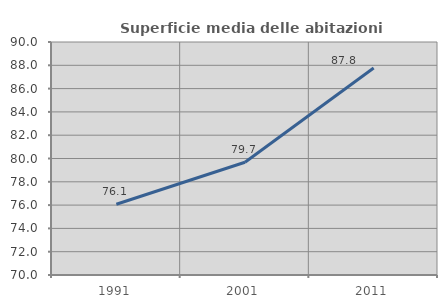
| Category | Superficie media delle abitazioni occupate |
|---|---|
| 1991.0 | 76.071 |
| 2001.0 | 79.681 |
| 2011.0 | 87.766 |